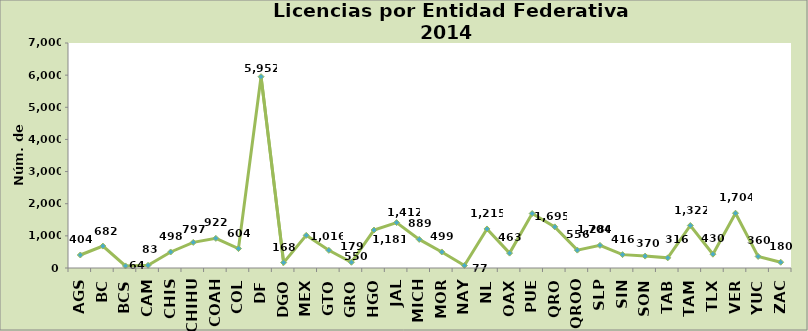
| Category | Series 0 |
|---|---|
| AGS | 404 |
| BC | 682 |
| BCS | 64 |
| CAM | 83 |
| CHIS | 498 |
| CHIHU | 797 |
| COAH | 922 |
| COL | 604 |
| DF | 5952 |
| DGO | 168 |
| MEX | 1016 |
| GTO | 550 |
| GRO | 179 |
| HGO | 1181 |
| JAL | 1412 |
| MICH | 889 |
| MOR | 499 |
| NAY | 77 |
| NL | 1215 |
| OAX | 463 |
| PUE | 1695 |
| QRO | 1280 |
| QROO | 556 |
| SLP | 704 |
| SIN | 416 |
| SON | 370 |
| TAB | 316 |
| TAM | 1322 |
| TLX | 430 |
| VER | 1704 |
| YUC | 360 |
| ZAC | 180 |